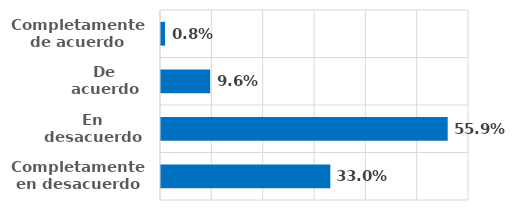
| Category | Series 0 |
|---|---|
| Completamente en desacuerdo | 0.33 |
| En desacuerdo | 0.559 |
| De acuerdo | 0.096 |
| Completamente de acuerdo | 0.008 |